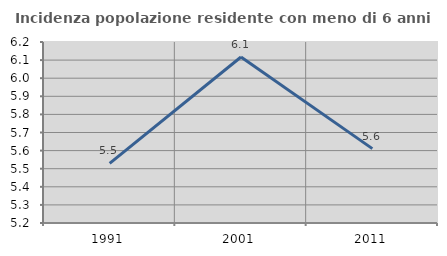
| Category | Incidenza popolazione residente con meno di 6 anni |
|---|---|
| 1991.0 | 5.53 |
| 2001.0 | 6.117 |
| 2011.0 | 5.611 |